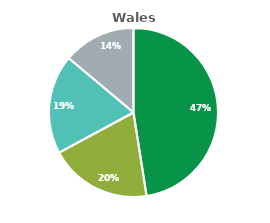
| Category | Wales |
|---|---|
| ASHP | 2835 |
| Biomass | 1170 |
| GSHP | 1132 |
| Solar Thermal | 829 |